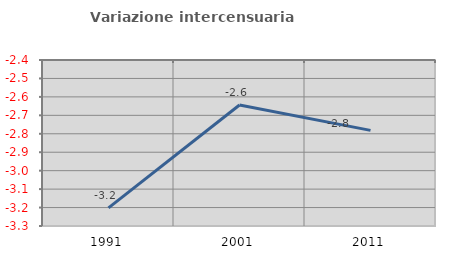
| Category | Variazione intercensuaria annua |
|---|---|
| 1991.0 | -3.202 |
| 2001.0 | -2.644 |
| 2011.0 | -2.782 |